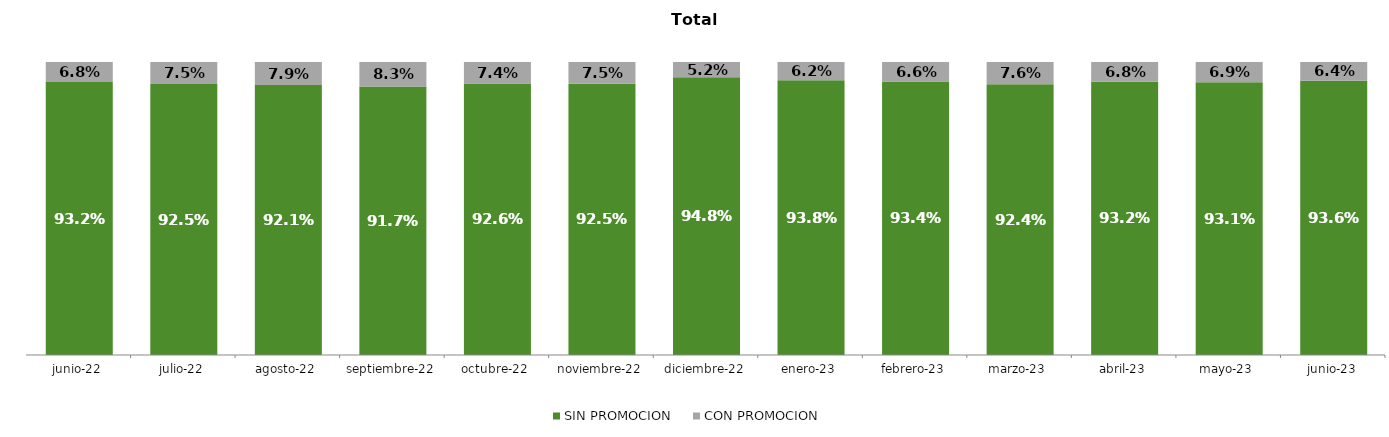
| Category | SIN PROMOCION   | CON PROMOCION   |
|---|---|---|
| 2022-06-01 | 0.932 | 0.068 |
| 2022-07-01 | 0.925 | 0.075 |
| 2022-08-01 | 0.921 | 0.079 |
| 2022-09-01 | 0.917 | 0.083 |
| 2022-10-01 | 0.926 | 0.074 |
| 2022-11-01 | 0.925 | 0.075 |
| 2022-12-01 | 0.948 | 0.052 |
| 2023-01-01 | 0.938 | 0.062 |
| 2023-02-01 | 0.934 | 0.066 |
| 2023-03-01 | 0.924 | 0.076 |
| 2023-04-01 | 0.932 | 0.068 |
| 2023-05-01 | 0.931 | 0.069 |
| 2023-06-01 | 0.936 | 0.064 |